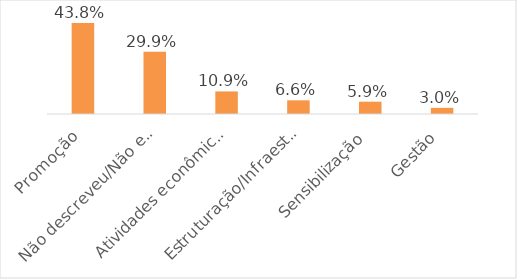
| Category | Series 0 |
|---|---|
| Promoção | 0.438 |
| Não descreveu/Não entendeu | 0.299 |
| Atividades econômicas/Produção associada | 0.109 |
| Estruturação/Infraestrutura | 0.066 |
| Sensibilização | 0.059 |
| Gestão | 0.03 |